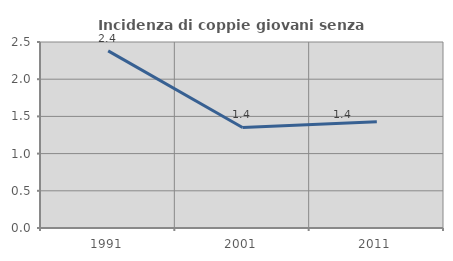
| Category | Incidenza di coppie giovani senza figli |
|---|---|
| 1991.0 | 2.381 |
| 2001.0 | 1.351 |
| 2011.0 | 1.429 |